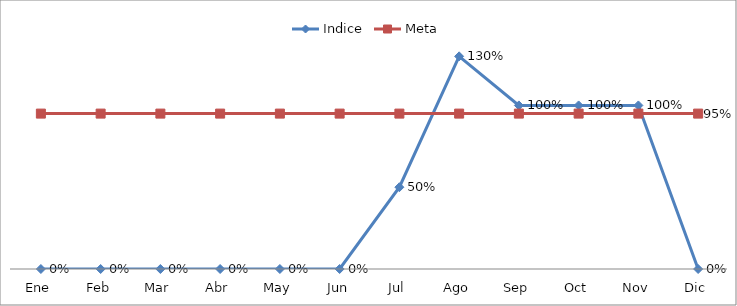
| Category | Indice | Meta |
|---|---|---|
| Ene | 0 | 0.95 |
| Feb | 0 | 0.95 |
| Mar | 0 | 0.95 |
| Abr | 0 | 0.95 |
| May | 0 | 0.95 |
| Jun | 0 | 0.95 |
| Jul | 0.5 | 0.95 |
| Ago | 1.3 | 0.95 |
| Sep | 1 | 0.95 |
| Oct | 1 | 0.95 |
| Nov | 1 | 0.95 |
| Dic | 0 | 0.95 |